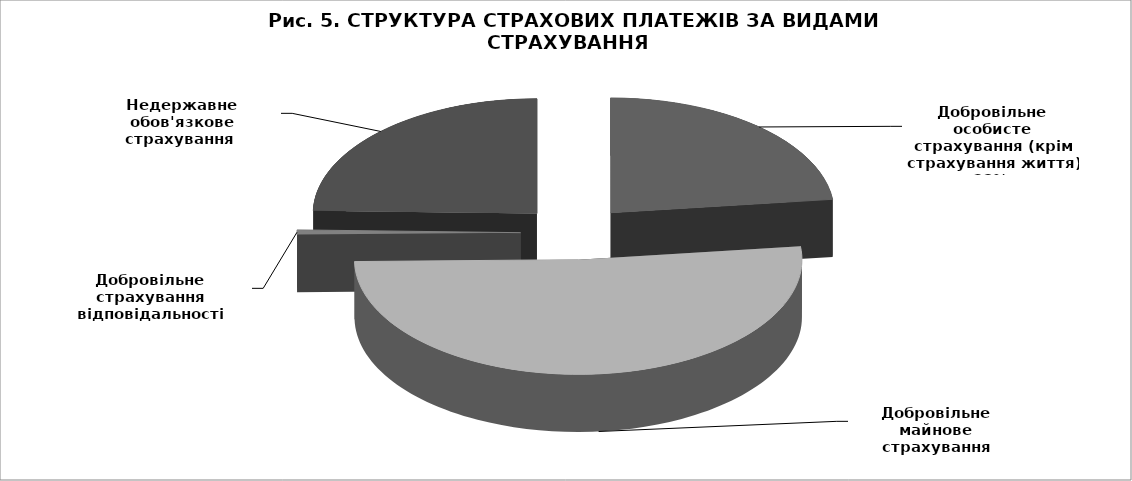
| Category | Series 0 |
|---|---|
| Добровільне особисте страхування (крім страхування життя) | 388483.9 |
| Добровільне майнове страхування | 866286.5 |
| Добровільне страхування відповідальності | 11006 |
| Недержавне обов'язкове страхування  | 413274.8 |